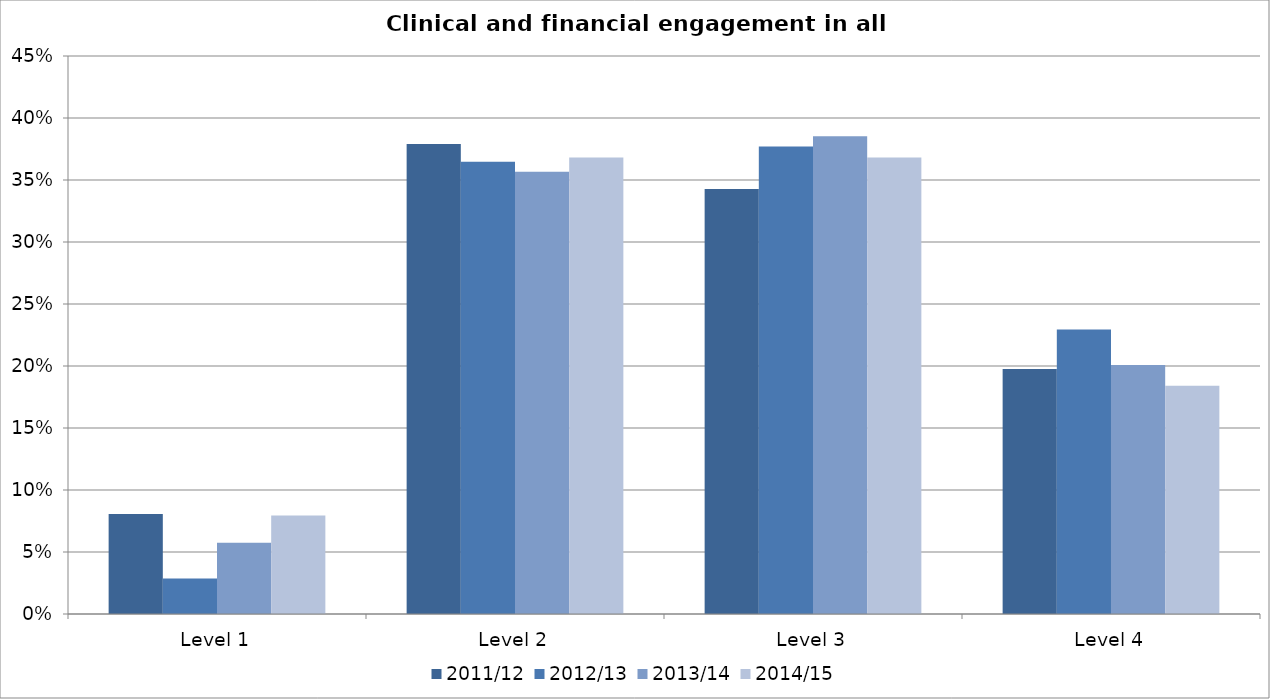
| Category | 2011/12 | 2012/13 | 2013/14 | 2014/15 |
|---|---|---|---|---|
| Level 1 | 0.081 | 0.029 | 0.057 | 0.079 |
| Level 2 | 0.379 | 0.365 | 0.357 | 0.368 |
| Level 3 | 0.343 | 0.377 | 0.385 | 0.368 |
| Level 4 | 0.198 | 0.23 | 0.201 | 0.184 |